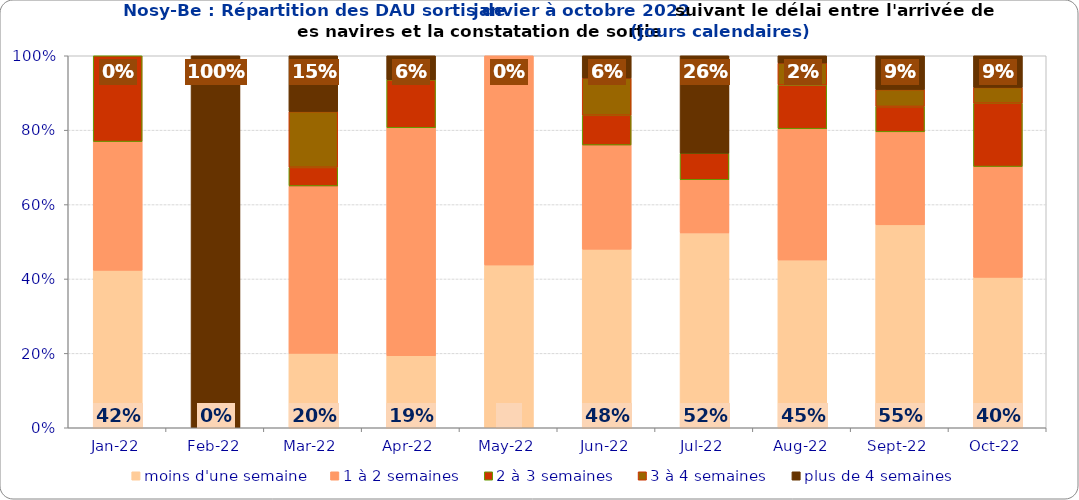
| Category | moins d'une semaine | 1 à 2 semaines | 2 à 3 semaines | 3 à 4 semaines | plus de 4 semaines |
|---|---|---|---|---|---|
| 2022-01-01 | 0.423 | 0.346 | 0.231 | 0 | 0 |
| 2022-02-01 | 0 | 0 | 0 | 0 | 1 |
| 2022-03-01 | 0.2 | 0.45 | 0.05 | 0.15 | 0.15 |
| 2022-04-01 | 0.194 | 0.613 | 0.129 | 0 | 0.065 |
| 2022-05-01 | 0.438 | 0.562 | 0 | 0 | 0 |
| 2022-06-01 | 0.48 | 0.28 | 0.08 | 0.1 | 0.06 |
| 2022-07-01 | 0.524 | 0.143 | 0.071 | 0 | 0.262 |
| 2022-08-01 | 0.451 | 0.353 | 0.118 | 0.059 | 0.02 |
| 2022-09-01 | 0.545 | 0.25 | 0.068 | 0.045 | 0.091 |
| 2022-10-01 | 0.404 | 0.298 | 0.17 | 0.043 | 0.085 |